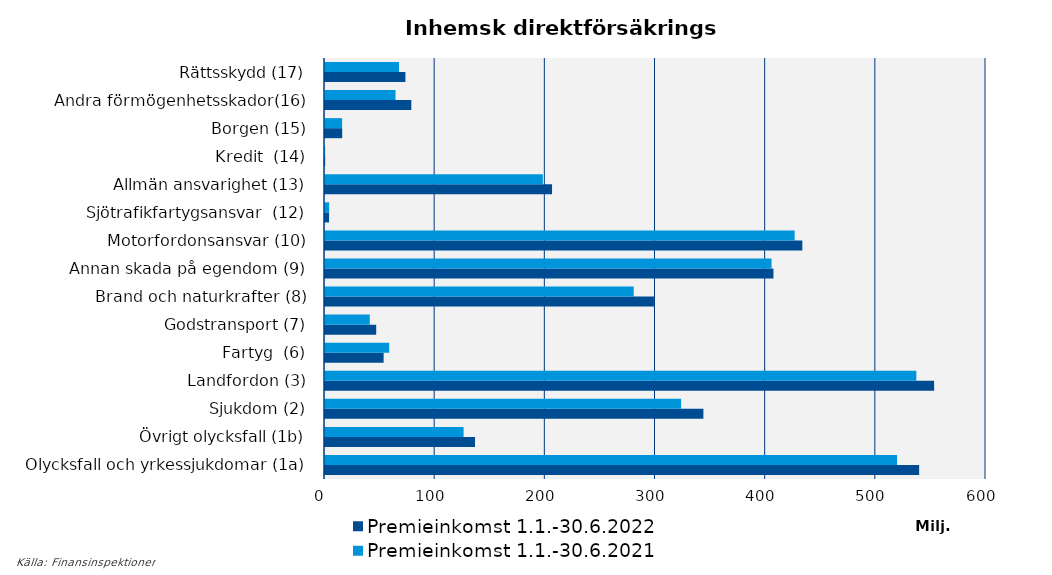
| Category | Premieinkomst |
|---|---|
| Olycksfall och yrkessjukdomar (1a) | 519287.794 |
| Övrigt olycksfall (1b) | 125804.516 |
| Sjukdom (2) | 323263.784 |
| Landfordon (3) | 536756.735 |
| Fartyg  (6) | 58273.936 |
| Godstransport (7) | 40669.453 |
| Brand och naturkrafter (8) | 280218.114 |
| Annan skada på egendom (9) | 405337.963 |
| Motorfordonsansvar (10) | 426312.893 |
| Sjötrafikfartygsansvar  (12) | 3808.364 |
| Allmän ansvarighet (13) | 197728.066 |
| Kredit  (14) | 148.165 |
| Borgen (15) | 15512.136 |
| Andra förmögenhetsskador(16) | 64006.947 |
| Rättsskydd (17) | 67164.273 |